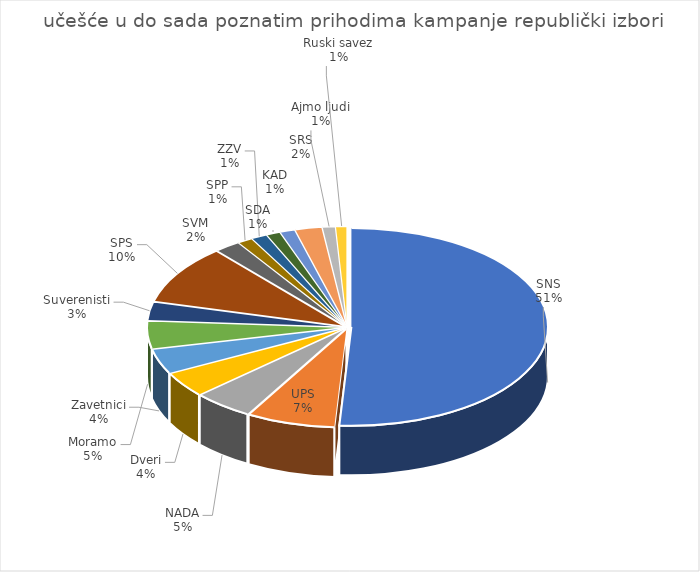
| Category | Series 7 |
|---|---|
| SNS | 9566944.455 |
| UPS | 1369347.497 |
| NADA | 930947.52 |
| Dveri | 780632.403 |
| Zavetnici | 768386.887 |
| Moramo | 852514.759 |
| Suverenisti | 566271.518 |
| SPS | 1813402.615 |
| SVM | 398532.149 |
| SPP | 234872.003 |
| ZZV | 245554.725 |
| SDA | 215348.894 |
| KAD | 231929.997 |
| SRS | 416546.974 |
| Ajmo ljudi | 200495.388 |
| Ruski savez | 174237.392 |